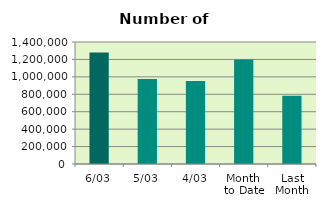
| Category | Series 0 |
|---|---|
| 6/03 | 1280340 |
| 5/03 | 974390 |
| 4/03 | 951780 |
| Month 
to Date | 1197901.2 |
| Last
Month | 783511.9 |